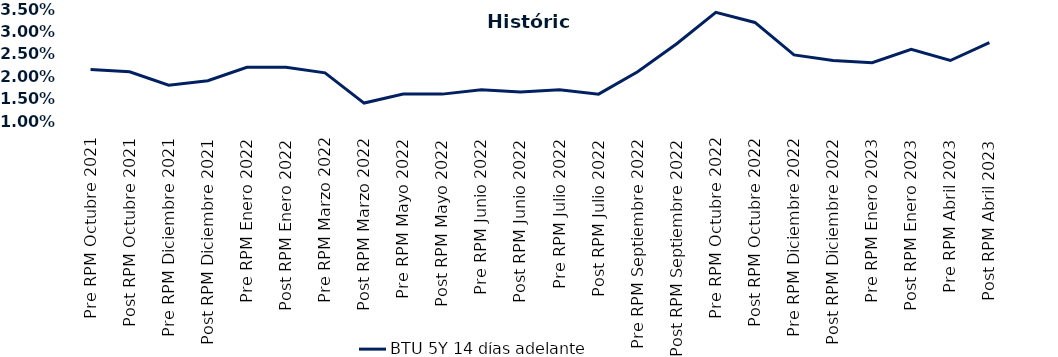
| Category | BTU 5Y 14 días adelante |
|---|---|
| Pre RPM Octubre 2021 | 0.022 |
| Post RPM Octubre 2021 | 0.021 |
| Pre RPM Diciembre 2021 | 0.018 |
| Post RPM Diciembre 2021 | 0.019 |
| Pre RPM Enero 2022 | 0.022 |
| Post RPM Enero 2022 | 0.022 |
| Pre RPM Marzo 2022 | 0.021 |
| Post RPM Marzo 2022 | 0.014 |
| Pre RPM Mayo 2022 | 0.016 |
| Post RPM Mayo 2022 | 0.016 |
| Pre RPM Junio 2022 | 0.017 |
| Post RPM Junio 2022 | 0.016 |
| Pre RPM Julio 2022 | 0.017 |
| Post RPM Julio 2022 | 0.016 |
| Pre RPM Septiembre 2022 | 0.021 |
| Post RPM Septiembre 2022 | 0.027 |
| Pre RPM Octubre 2022 | 0.034 |
| Post RPM Octubre 2022 | 0.032 |
| Pre RPM Diciembre 2022 | 0.025 |
| Post RPM Diciembre 2022 | 0.024 |
| Pre RPM Enero 2023 | 0.023 |
| Post RPM Enero 2023 | 0.026 |
| Pre RPM Abril 2023 | 0.024 |
| Post RPM Abril 2023 | 0.028 |